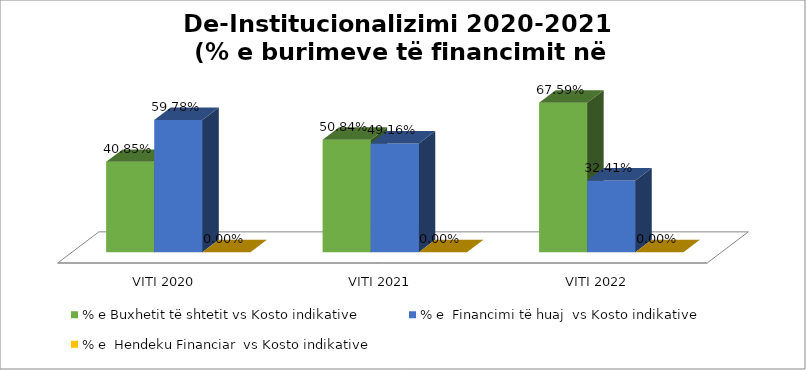
| Category | % e Buxhetit të shtetit vs Kosto indikative | % e  Financimi të huaj  vs Kosto indikative | % e  Hendeku Financiar  vs Kosto indikative |
|---|---|---|---|
| VITI 2020 | 0.409 | 0.598 | 0 |
| VITI 2021 | 0.508 | 0.492 | 0 |
| VITI 2022 | 0.676 | 0.324 | 0 |